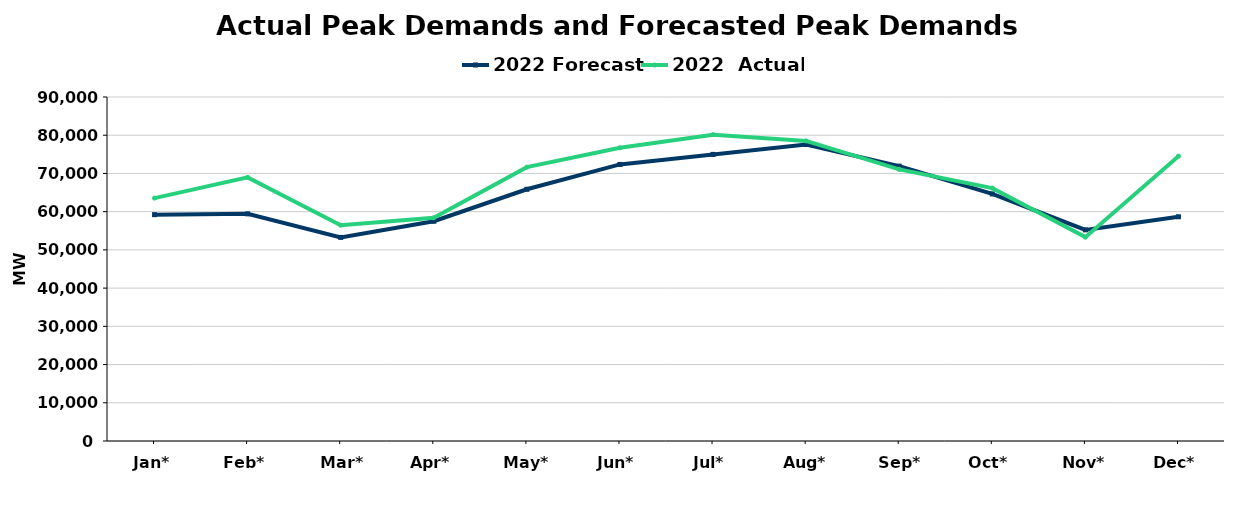
| Category | 2022 Forecast | 2022  Actual |
|---|---|---|
| Jan* | 59218 | 63541 |
| Feb* | 59429 | 68968 |
| Mar* | 53275 | 56463 |
| Apr* | 57493 | 58419 |
| May* | 65858 | 71645 |
| Jun* | 72356 | 76718 |
| Jul* | 74984 | 80148 |
| Aug* | 77579 | 78505 |
| Sep* | 71902 | 71075 |
| Oct* | 64650 | 66153 |
| Nov* | 55240 | 53336 |
| Dec* | 58667 | 74525 |